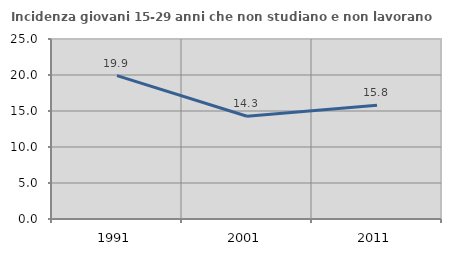
| Category | Incidenza giovani 15-29 anni che non studiano e non lavorano  |
|---|---|
| 1991.0 | 19.912 |
| 2001.0 | 14.27 |
| 2011.0 | 15.783 |